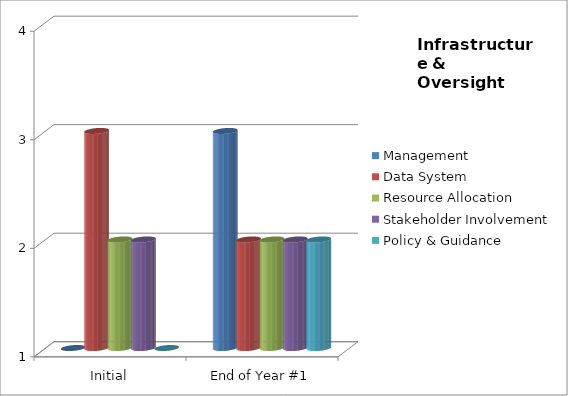
| Category | Management  | Data System  | Resource Allocation  | Stakeholder Involvement  | Policy & Guidance  |
|---|---|---|---|---|---|
| Initial | 1 | 3 | 2 | 2 | 1 |
| End of Year #1 | 3 | 2 | 2 | 2 | 2 |